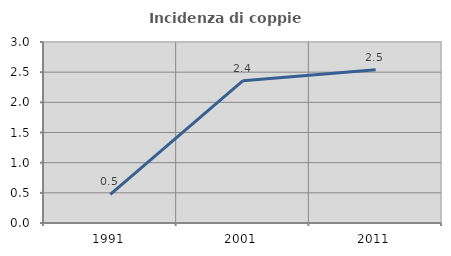
| Category | Incidenza di coppie miste |
|---|---|
| 1991.0 | 0.474 |
| 2001.0 | 2.358 |
| 2011.0 | 2.538 |